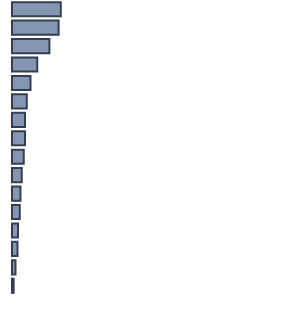
| Category | Series 0 |
|---|---|
| 0 | 18 |
| 1 | 17.2 |
| 2 | 13.8 |
| 3 | 9.3 |
| 4 | 6.8 |
| 5 | 5.4 |
| 6 | 4.8 |
| 7 | 4.8 |
| 8 | 4.3 |
| 9 | 3.6 |
| 10 | 3.1 |
| 11 | 2.9 |
| 12 | 2.2 |
| 13 | 2 |
| 14 | 1.3 |
| 15 | 0.6 |